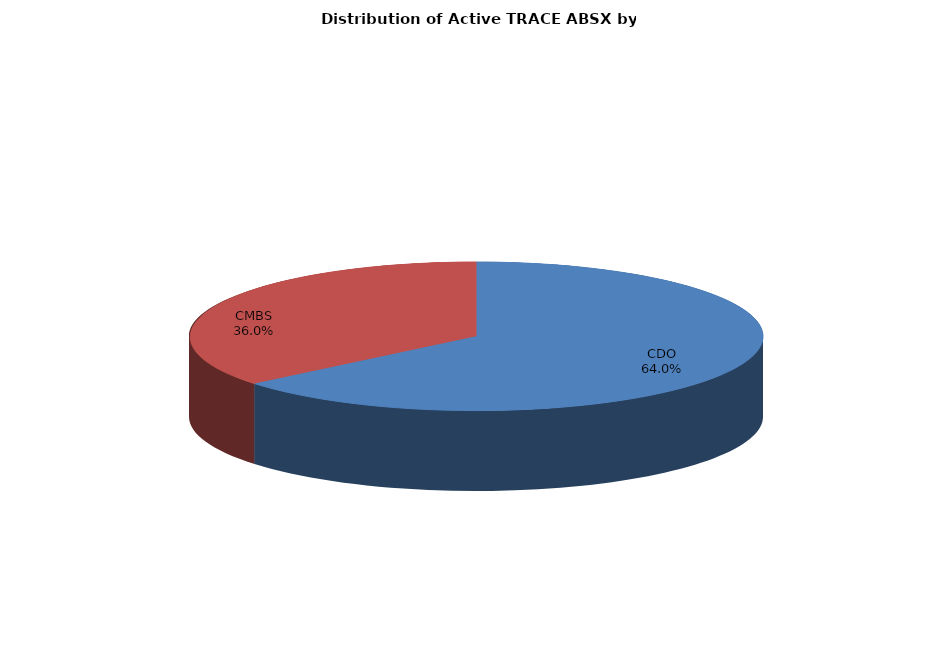
| Category | Series 0 |
|---|---|
| CDO | 51432 |
| CMBS | 28897 |